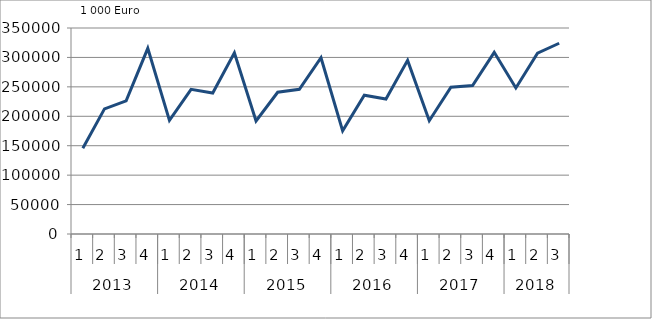
| Category | Ausbaugewerblicher Umsatz3 |
|---|---|
| 0 | 145792.596 |
| 1 | 212577 |
| 2 | 226327.748 |
| 3 | 315433.896 |
| 4 | 193004.858 |
| 5 | 245754.159 |
| 6 | 239547.85 |
| 7 | 307688.935 |
| 8 | 192043.756 |
| 9 | 240826.879 |
| 10 | 245916.087 |
| 11 | 299455.378 |
| 12 | 175225.59 |
| 13 | 235781.631 |
| 14 | 229227.559 |
| 15 | 294992.157 |
| 16 | 192499.539 |
| 17 | 249394.388 |
| 18 | 252146.755 |
| 19 | 308653.153 |
| 20 | 248133.418 |
| 21 | 307099.899 |
| 22 | 324088.989 |